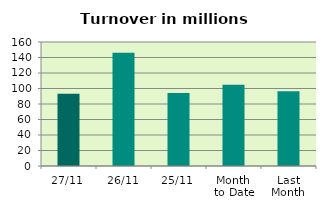
| Category | Series 0 |
|---|---|
| 27/11 | 93.176 |
| 26/11 | 146.289 |
| 25/11 | 94.067 |
| Month 
to Date | 104.743 |
| Last
Month | 96.433 |